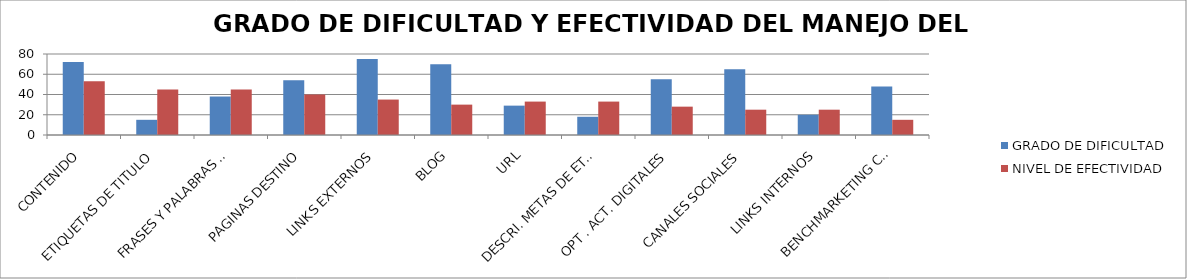
| Category | GRADO DE DIFICULTAD | NIVEL DE EFECTIVIDAD |
|---|---|---|
|  CONTENIDO | 72 | 53 |
| ETIQUETAS DE TITULO | 15 | 45 |
| FRASES Y PALABRAS CLAVE | 38 | 45 |
| PAGINAS DESTINO | 54 | 40 |
|  LINKS EXTERNOS | 75 | 35 |
| BLOG | 70 | 30 |
| URL | 29 | 33 |
| DESCRI. METAS DE ETIQUETAS | 18 | 33 |
| OPT . ACT. DIGITALES | 55 | 28 |
|  CANALES SOCIALES | 65 | 25 |
| LINKS INTERNOS | 20 | 25 |
| BENCHMARKETING COMPETIDOR | 48 | 15 |